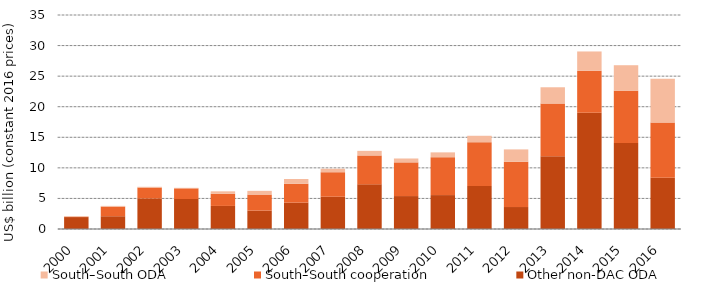
| Category | Other non-DAC ODA | South–South cooperation | South–South ODA |
|---|---|---|---|
| 2000.0 | 1.95 | 0.043 | 0.12 |
| 2001.0 | 2.089 | 1.57 | 0.121 |
| 2002.0 | 4.983 | 1.795 | 0.123 |
| 2003.0 | 4.91 | 1.734 | 0.091 |
| 2004.0 | 3.772 | 1.999 | 0.39 |
| 2005.0 | 3.015 | 2.618 | 0.604 |
| 2006.0 | 4.31 | 3.088 | 0.778 |
| 2007.0 | 5.274 | 4.013 | 0.57 |
| 2008.0 | 7.302 | 4.726 | 0.752 |
| 2009.0 | 5.386 | 5.512 | 0.635 |
| 2010.0 | 5.546 | 6.204 | 0.782 |
| 2011.0 | 7.025 | 7.18 | 1.042 |
| 2012.0 | 3.594 | 7.403 | 2.022 |
| 2013.0 | 11.896 | 8.61 | 2.674 |
| 2014.0 | 19.027 | 6.851 | 3.159 |
| 2015.0 | 14.077 | 8.515 | 4.193 |
| 2016.0 | 8.382 | 9.045 | 7.159 |